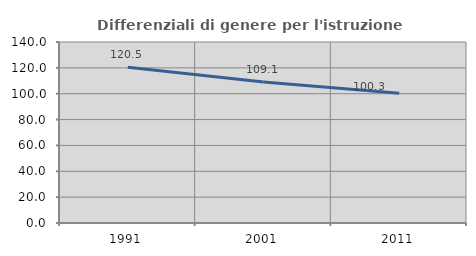
| Category | Differenziali di genere per l'istruzione superiore |
|---|---|
| 1991.0 | 120.535 |
| 2001.0 | 109.051 |
| 2011.0 | 100.287 |